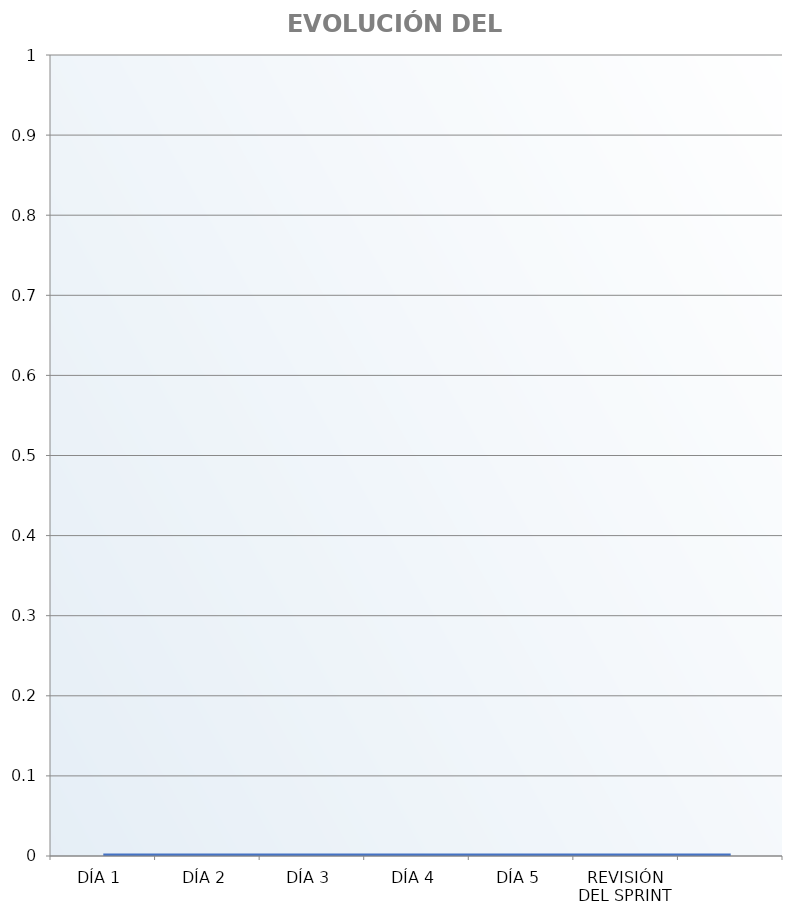
| Category | Gráfico de evolución del sprint |
|---|---|
| DÍA 1 | 0 |
| DÍA 2 | 0 |
| DÍA 3 | 0 |
| DÍA 4 | 0 |
| DÍA 5 | 0 |
| REVISIÓN DEL SPRINT | 0 |